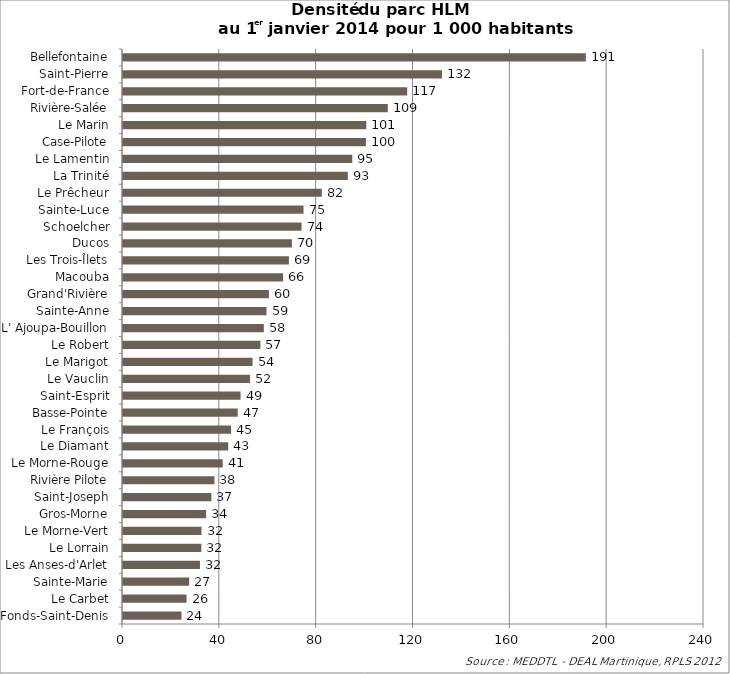
| Category | Series 0 |
|---|---|
| Fonds-Saint-Denis | 24.155 |
| Le Carbet | 26.231 |
| Sainte-Marie | 27.332 |
| Les Anses-d'Arlet | 31.795 |
| Le Lorrain | 32.355 |
| Le Morne-Vert | 32.43 |
| Gros-Morne | 34.341 |
| Saint-Joseph | 36.521 |
| Rivière Pilote | 37.776 |
| Le Morne-Rouge | 41.175 |
| Le Diamant | 43.456 |
| Le François | 44.656 |
| Basse-Pointe | 47.382 |
| Saint-Esprit | 48.567 |
| Le Vauclin | 52.488 |
| Le Marigot | 53.531 |
| Le Robert | 56.757 |
| L' Ajoupa-Bouillon | 58.166 |
| Sainte-Anne | 59.289 |
| Grand'Rivière | 60.264 |
| Macouba | 66.13 |
| Les Trois-Îlets | 68.538 |
| Ducos | 69.781 |
| Schoelcher | 73.77 |
| Sainte-Luce | 74.581 |
| Le Prêcheur | 82.117 |
| La Trinité | 92.87 |
| Le Lamentin | 94.71 |
| Case-Pilote | 100.337 |
| Le Marin | 100.503 |
| Rivière-Salée | 109.38 |
| Fort-de-France | 117.396 |
| Saint-Pierre | 131.767 |
| Bellefontaine | 191.196 |